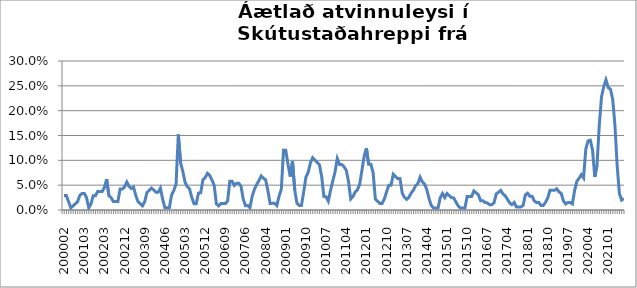
| Category | Series 0 |
|---|---|
| 200002 | 0.029 |
| 200003 | 0.029 |
| 200004 | 0.017 |
| 200005 | 0.004 |
| 200010 | 0.008 |
| 200011 | 0.012 |
| 200012 | 0.017 |
| 200101 | 0.029 |
| 200102 | 0.033 |
| 200103 | 0.033 |
| 200104 | 0.025 |
| 200105 | 0.004 |
| 200109 | 0.012 |
| 200110 | 0.029 |
| 200111 | 0.029 |
| 200112 | 0.037 |
| 200201 | 0.037 |
| 200202 | 0.037 |
| 200203 | 0.045 |
| 200204 | 0.062 |
| 200205 | 0.029 |
| 200206 | 0.025 |
| 200207 | 0.017 |
| 200208 | 0.017 |
| 200209 | 0.017 |
| 200210 | 0.042 |
| 200211 | 0.042 |
| 200212 | 0.046 |
| 200301 | 0.056 |
| 200302 | 0.048 |
| 200303 | 0.043 |
| 200304 | 0.046 |
| 200305 | 0.029 |
| 200306 | 0.017 |
| 200307 | 0.013 |
| 200308 | 0.008 |
| 200309 | 0.017 |
| 200310 | 0.035 |
| 200311 | 0.04 |
| 200312 | 0.044 |
| 200401 | 0.04 |
| 200402 | 0.036 |
| 200403 | 0.036 |
| 200404 | 0.044 |
| 200405 | 0.022 |
| 200406 | 0.004 |
| 200407 | 0.004 |
| 200408 | 0.004 |
| 200409 | 0.03 |
| 200410 | 0.039 |
| 200411 | 0.052 |
| 200412 | 0.152 |
| 200501 | 0.095 |
| 200502 | 0.078 |
| 200503 | 0.056 |
| 200504 | 0.047 |
| 200505 | 0.043 |
| 200506 | 0.026 |
| 200507 | 0.013 |
| 200508 | 0.013 |
| 200509 | 0.034 |
| 200510 | 0.035 |
| 200511 | 0.061 |
| 200512 | 0.065 |
| 200601 | 0.074 |
| 200602 | 0.07 |
| 200603 | 0.061 |
| 200604 | 0.05 |
| 200605 | 0.012 |
| 200606 | 0.008 |
| 200607 | 0.013 |
| 200608 | 0.013 |
| 200609 | 0.013 |
| 200610 | 0.018 |
| 200611 | 0.058 |
| 200612 | 0.058 |
| 200701 | 0.049 |
| 200702 | 0.054 |
| 200703 | 0.054 |
| 200704 | 0.048 |
| 200705 | 0.022 |
| 200706 | 0.009 |
| 200707 | 0.009 |
| 200708 | 0.004 |
| 200710 | 0.028 |
| 200711 | 0.042 |
| 200712 | 0.051 |
| 200801 | 0.059 |
| 200802 | 0.068 |
| 200803 | 0.064 |
| 200804 | 0.061 |
| 200805 | 0.039 |
| 200806 | 0.013 |
| 200807 | 0.013 |
| 200808 | 0.013 |
| 200809 | 0.009 |
| 200810 | 0.028 |
| 200811 | 0.042 |
| 200812 | 0.12 |
| 200901 | 0.12 |
| 200902 | 0.091 |
| 200903 | 0.067 |
| 200904 | 0.098 |
| 200905 | 0.04 |
| 200906 | 0.013 |
| 200907 | 0.009 |
| 200908 | 0.009 |
| 200909 | 0.036 |
| 200910 | 0.066 |
| 200911 | 0.076 |
| 200912 | 0.095 |
| 201001 | 0.105 |
| 201002 | 0.1 |
| 201003 | 0.096 |
| 201004 | 0.091 |
| 201005 | 0.068 |
| 201006 | 0.027 |
| 201007 | 0.027 |
| 201008 | 0.018 |
| 201009 | 0.04 |
| 201010 | 0.059 |
| 201011 | 0.077 |
| 201012 | 0.104 |
| 201101 | 0.092 |
| 201102 | 0.092 |
| 201103 | 0.087 |
| 201104 | 0.08 |
| 201105 | 0.058 |
| 201106 | 0.022 |
| 201107 | 0.027 |
| 201108 | 0.036 |
| 201109 | 0.041 |
| 201110 | 0.052 |
| 201111 | 0.08 |
| 201112 | 0.108 |
| 201201 | 0.124 |
| 201202 | 0.092 |
| 201203 | 0.092 |
| 201204 | 0.075 |
| 201205 | 0.022 |
| 201206 | 0.018 |
| 201207 | 0.013 |
| 201208 | 0.013 |
| 201209 | 0.022 |
| 201210 | 0.036 |
| 201211 | 0.05 |
| 201212 | 0.05 |
| 201301 | 0.072 |
| 201302 | 0.068 |
| 201303 | 0.063 |
| 201304 | 0.064 |
| 201305 | 0.034 |
| 201306 | 0.025 |
| 201307 | 0.021 |
| 201308 | 0.026 |
| 201309 | 0.034 |
| 201310 | 0.04 |
| 201311 | 0.049 |
| 201312 | 0.053 |
| 201401 | 0.066 |
| 201402 | 0.057 |
| 201403 | 0.052 |
| 201404 | 0.041 |
| 201405 | 0.023 |
| 201406 | 0.009 |
| 201407 | 0.004 |
| 201408 | 0.004 |
| 201409 | 0.004 |
| 201410 | 0.025 |
| 201411 | 0.033 |
| 201412 | 0.025 |
| 201501 | 0.033 |
| 201502 | 0.029 |
| 201503 | 0.025 |
| 201504 | 0.024 |
| 201505 | 0.016 |
| 201506 | 0.008 |
| 201507 | 0.004 |
| 201508 | 0.004 |
| 201509 | 0.004 |
| 201510 | 0.027 |
| 201511 | 0.027 |
| 201512 | 0.027 |
| 201601 | 0.038 |
| 201602 | 0.035 |
| 201603 | 0.031 |
| 201604 | 0.019 |
| 201605 | 0.019 |
| 201606 | 0.015 |
| 201607 | 0.014 |
| 201608 | 0.011 |
| 201609 | 0.011 |
| 201610 | 0.014 |
| 201611 | 0.032 |
| 201612 | 0.036 |
| 201701 | 0.039 |
| 201702 | 0.032 |
| 201703 | 0.029 |
| 201704 | 0.021 |
| 201705 | 0.014 |
| 201706 | 0.011 |
| 201707 | 0.015 |
| 201708 | 0.006 |
| 201709 | 0.006 |
| 201710 | 0.006 |
| 201711 | 0.009 |
| 201712 | 0.03 |
| 201801 | 0.034 |
| 201802 | 0.028 |
| 201803 | 0.028 |
| 201804 | 0.018 |
| 201805 | 0.015 |
| 201806 | 0.015 |
| 201807 | 0.009 |
| 201808 | 0.009 |
| 201809 | 0.015 |
| 201810 | 0.025 |
| 201811 | 0.04 |
| 201812 | 0.04 |
| 201901 | 0.04 |
| 201902 | 0.043 |
| 201903 | 0.037 |
| 201904 | 0.034 |
| 201905 | 0.018 |
| 201906 | 0.012 |
| 201907 | 0.015 |
| 201908 | 0.015 |
| 201909 | 0.012 |
| 201910 | 0.04 |
| 201911 | 0.058 |
| 201912 | 0.064 |
| 202001 | 0.071 |
| 202002 | 0.065 |
| 202003 | 0.123 |
| 202004 | 0.139 |
| 202005 | 0.141 |
| 202006 | 0.121 |
| 202007 | 0.067 |
| 202008 | 0.09 |
| 202009 | 0.17 |
| 202010 | 0.228 |
| 202011 | 0.248 |
| 202012 | 0.262 |
| 202101 | 0.247 |
| 202102 | 0.243 |
| 202103 | 0.223 |
| 202104 | 0.172 |
| 202105 | 0.089 |
| 202106 | 0.033 |
| 202107 | 0.02 |
| 202108 | 0.023 |